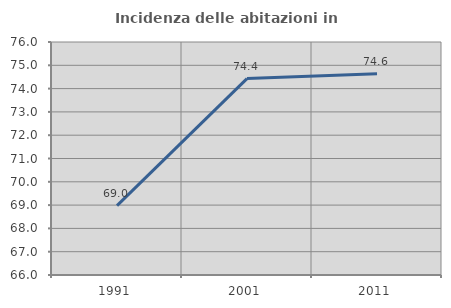
| Category | Incidenza delle abitazioni in proprietà  |
|---|---|
| 1991.0 | 68.976 |
| 2001.0 | 74.43 |
| 2011.0 | 74.634 |